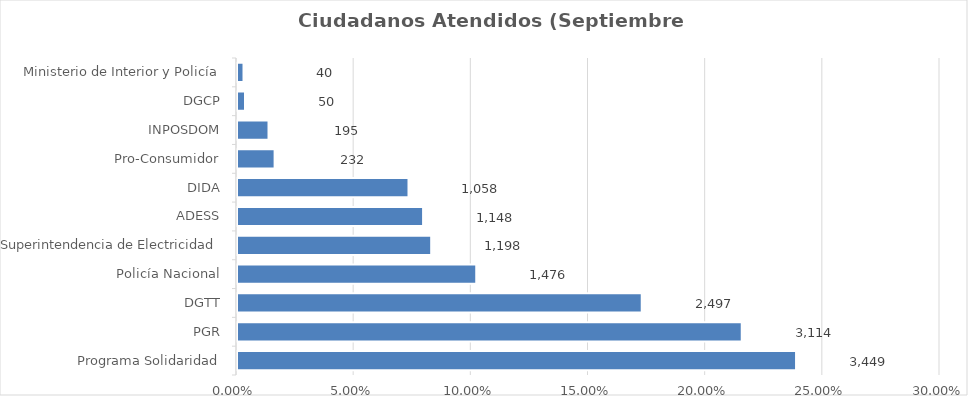
| Category | Porcentaje |
|---|---|
| Programa Solidaridad | 0.239 |
| PGR | 0.215 |
| DGTT | 0.173 |
| Policía Nacional | 0.102 |
| Superintendencia de Electricidad | 0.083 |
| ADESS | 0.079 |
| DIDA | 0.073 |
| Pro-Consumidor | 0.016 |
| INPOSDOM | 0.013 |
| DGCP | 0.003 |
| Ministerio de Interior y Policía | 0.003 |